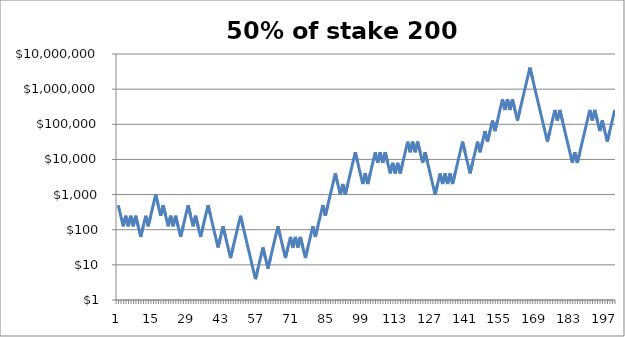
| Category | Series 0 |
|---|---|
| 0 | 500 |
| 1 | 250 |
| 2 | 125 |
| 3 | 250 |
| 4 | 125 |
| 5 | 250 |
| 6 | 125 |
| 7 | 250 |
| 8 | 125 |
| 9 | 62.5 |
| 10 | 125 |
| 11 | 250 |
| 12 | 125 |
| 13 | 250 |
| 14 | 500 |
| 15 | 1000 |
| 16 | 500 |
| 17 | 250 |
| 18 | 500 |
| 19 | 250 |
| 20 | 125 |
| 21 | 250 |
| 22 | 125 |
| 23 | 250 |
| 24 | 125 |
| 25 | 62.5 |
| 26 | 125 |
| 27 | 250 |
| 28 | 500 |
| 29 | 250 |
| 30 | 125 |
| 31 | 250 |
| 32 | 125 |
| 33 | 62.5 |
| 34 | 125 |
| 35 | 250 |
| 36 | 500 |
| 37 | 250 |
| 38 | 125 |
| 39 | 62.5 |
| 40 | 31.25 |
| 41 | 62.5 |
| 42 | 125 |
| 43 | 62.5 |
| 44 | 31.25 |
| 45 | 15.625 |
| 46 | 31.25 |
| 47 | 62.5 |
| 48 | 125 |
| 49 | 250 |
| 50 | 125 |
| 51 | 62.5 |
| 52 | 31.25 |
| 53 | 15.625 |
| 54 | 7.812 |
| 55 | 3.906 |
| 56 | 7.812 |
| 57 | 15.625 |
| 58 | 31.25 |
| 59 | 15.625 |
| 60 | 7.812 |
| 61 | 15.625 |
| 62 | 31.25 |
| 63 | 62.5 |
| 64 | 125 |
| 65 | 62.5 |
| 66 | 31.25 |
| 67 | 15.625 |
| 68 | 31.25 |
| 69 | 62.5 |
| 70 | 31.25 |
| 71 | 62.5 |
| 72 | 31.25 |
| 73 | 62.5 |
| 74 | 31.25 |
| 75 | 15.625 |
| 76 | 31.25 |
| 77 | 62.5 |
| 78 | 125 |
| 79 | 62.5 |
| 80 | 125 |
| 81 | 250 |
| 82 | 500 |
| 83 | 250 |
| 84 | 500 |
| 85 | 1000 |
| 86 | 2000 |
| 87 | 4000 |
| 88 | 2000 |
| 89 | 1000 |
| 90 | 2000 |
| 91 | 1000 |
| 92 | 2000 |
| 93 | 4000 |
| 94 | 8000 |
| 95 | 16000 |
| 96 | 8000 |
| 97 | 4000 |
| 98 | 2000 |
| 99 | 4000 |
| 100 | 2000 |
| 101 | 4000 |
| 102 | 8000 |
| 103 | 16000 |
| 104 | 8000 |
| 105 | 16000 |
| 106 | 8000 |
| 107 | 16000 |
| 108 | 8000 |
| 109 | 4000 |
| 110 | 8000 |
| 111 | 4000 |
| 112 | 8000 |
| 113 | 4000 |
| 114 | 8000 |
| 115 | 16000 |
| 116 | 32000 |
| 117 | 16000 |
| 118 | 32000 |
| 119 | 16000 |
| 120 | 32000 |
| 121 | 16000 |
| 122 | 8000 |
| 123 | 16000 |
| 124 | 8000 |
| 125 | 4000 |
| 126 | 2000 |
| 127 | 1000 |
| 128 | 2000 |
| 129 | 4000 |
| 130 | 2000 |
| 131 | 4000 |
| 132 | 2000 |
| 133 | 4000 |
| 134 | 2000 |
| 135 | 4000 |
| 136 | 8000 |
| 137 | 16000 |
| 138 | 32000 |
| 139 | 16000 |
| 140 | 8000 |
| 141 | 4000 |
| 142 | 8000 |
| 143 | 16000 |
| 144 | 32000 |
| 145 | 16000 |
| 146 | 32000 |
| 147 | 64000 |
| 148 | 32000 |
| 149 | 64000 |
| 150 | 128000 |
| 151 | 64000 |
| 152 | 128000 |
| 153 | 256000 |
| 154 | 512000 |
| 155 | 256000 |
| 156 | 512000 |
| 157 | 256000 |
| 158 | 512000 |
| 159 | 256000 |
| 160 | 128000 |
| 161 | 256000 |
| 162 | 512000 |
| 163 | 1024000 |
| 164 | 2048000 |
| 165 | 4096000 |
| 166 | 2048000 |
| 167 | 1024000 |
| 168 | 512000 |
| 169 | 256000 |
| 170 | 128000 |
| 171 | 64000 |
| 172 | 32000 |
| 173 | 64000 |
| 174 | 128000 |
| 175 | 256000 |
| 176 | 128000 |
| 177 | 256000 |
| 178 | 128000 |
| 179 | 64000 |
| 180 | 32000 |
| 181 | 16000 |
| 182 | 8000 |
| 183 | 16000 |
| 184 | 8000 |
| 185 | 16000 |
| 186 | 32000 |
| 187 | 64000 |
| 188 | 128000 |
| 189 | 256000 |
| 190 | 128000 |
| 191 | 256000 |
| 192 | 128000 |
| 193 | 64000 |
| 194 | 128000 |
| 195 | 64000 |
| 196 | 32000 |
| 197 | 64000 |
| 198 | 128000 |
| 199 | 256000 |